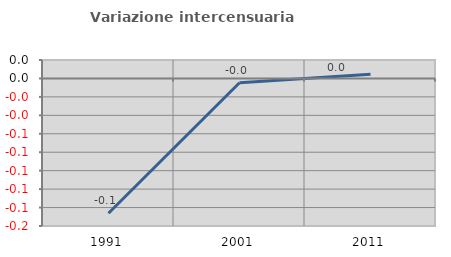
| Category | Variazione intercensuaria annua |
|---|---|
| 1991.0 | -0.146 |
| 2001.0 | -0.005 |
| 2011.0 | 0.005 |